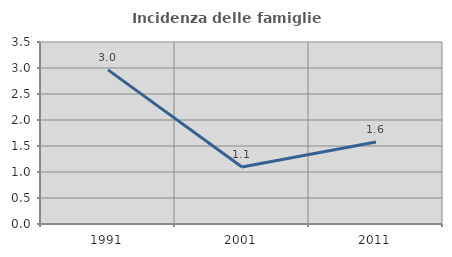
| Category | Incidenza delle famiglie numerose |
|---|---|
| 1991.0 | 2.964 |
| 2001.0 | 1.095 |
| 2011.0 | 1.576 |